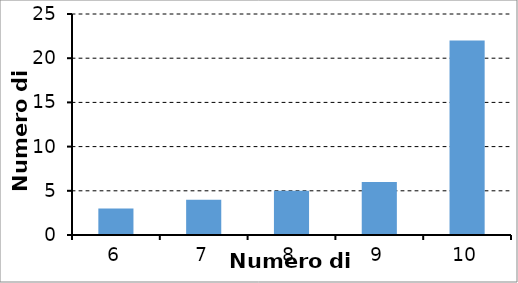
| Category | Series 0 |
|---|---|
| 6.0 | 3 |
| 7.0 | 4 |
| 8.0 | 5 |
| 9.0 | 6 |
| 10.0 | 22 |